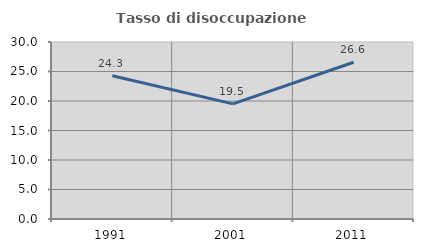
| Category | Tasso di disoccupazione giovanile  |
|---|---|
| 1991.0 | 24.274 |
| 2001.0 | 19.512 |
| 2011.0 | 26.562 |